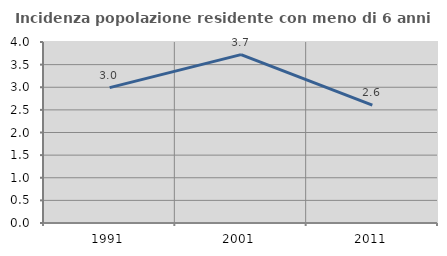
| Category | Incidenza popolazione residente con meno di 6 anni |
|---|---|
| 1991.0 | 2.991 |
| 2001.0 | 3.721 |
| 2011.0 | 2.606 |